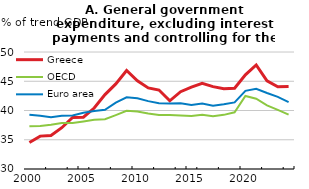
| Category | Greece | OECD | Euro area |
|---|---|---|---|
| 2000-12-31 | 34.537 | 37.3 | 39.272 |
| 2001-12-31 | 35.62 | 37.356 | 39.092 |
| 2002-12-31 | 35.734 | 37.554 | 38.863 |
| 2003-12-31 | 37.057 | 37.857 | 39.098 |
| 2004-12-31 | 38.824 | 37.848 | 39.164 |
| 2005-12-31 | 38.862 | 38.134 | 39.606 |
| 2006-12-31 | 40.421 | 38.405 | 39.928 |
| 2007-12-31 | 42.725 | 38.5 | 40.11 |
| 2008-12-31 | 44.55 | 39.213 | 41.349 |
| 2009-12-31 | 46.835 | 39.945 | 42.246 |
| 2010-12-31 | 45.076 | 39.825 | 42.075 |
| 2011-12-31 | 43.861 | 39.47 | 41.604 |
| 2012-12-31 | 43.496 | 39.23 | 41.24 |
| 2013-12-31 | 41.658 | 39.213 | 41.202 |
| 2014-12-31 | 43.219 | 39.162 | 41.227 |
| 2015-12-31 | 43.999 | 39.052 | 40.95 |
| 2016-12-31 | 44.644 | 39.273 | 41.18 |
| 2017-12-31 | 44.079 | 39.031 | 40.813 |
| 2018-12-31 | 43.717 | 39.256 | 41.072 |
| 2019-12-31 | 43.804 | 39.687 | 41.381 |
| 2020-12-31 | 46.099 | 42.477 | 43.354 |
| 2021-12-31 | 47.777 | 42.015 | 43.711 |
| 2022-12-31 | 45.068 | 40.862 | 42.996 |
| 2023-12-31 | 44.047 | 40.106 | 42.331 |
| 2024-12-31 | 44.089 | 39.281 | 41.441 |